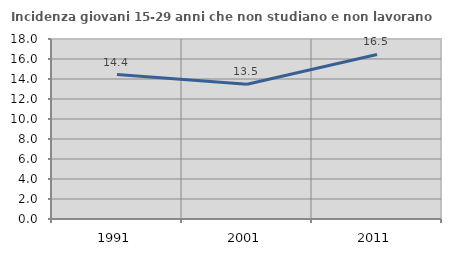
| Category | Incidenza giovani 15-29 anni che non studiano e non lavorano  |
|---|---|
| 1991.0 | 14.448 |
| 2001.0 | 13.475 |
| 2011.0 | 16.457 |